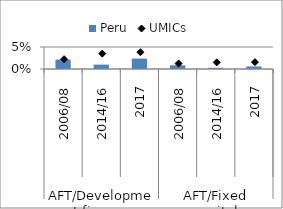
| Category | Peru |
|---|---|
| 0 | 0.021 |
| 1 | 0.01 |
| 2 | 0.024 |
| 3 | 0.008 |
| 4 | 0.003 |
| 5 | 0.006 |